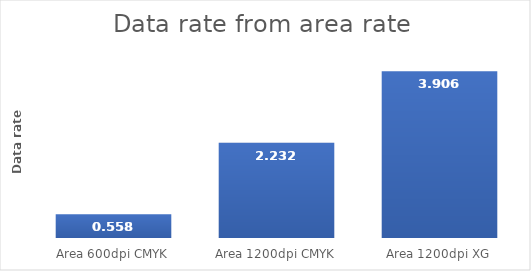
| Category | Series 0 |
|---|---|
| Area 600dpi CMYK | 0.558 |
| Area 1200dpi CMYK | 2.232 |
| Area 1200dpi XG | 3.906 |